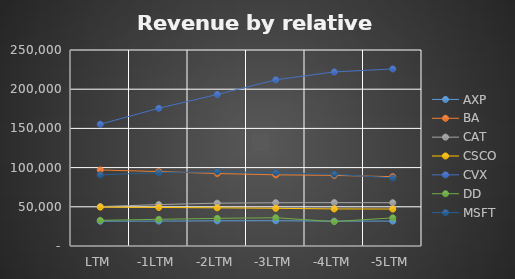
| Category | AXP | BA | CAT | CSCO | CVX | DD | MSFT |
|---|---|---|---|---|---|---|---|
| LTM | 31614 | 97009 | 50225 | 49598 | 155318 | 32737 | 90758 |
| -1LTM | 31765 | 94944 | 52812 | 49161 | 175682 | 34035 | 93580 |
| -2LTM | 32090 | 92446 | 54645 | 48675 | 193263 | 35271 | 94782 |
| -3LTM | 32248 | 90762 | 55184 | 48083 | 211970 | 36046 | 93456 |
| -4LTM | 31713 | 90079 | 55342 | 47302 | 222040 | 31142 | 91505 |
| -5LTM | 31780 | 88425 | 55216 | 47142 | 225864 | 35900 | 86833 |